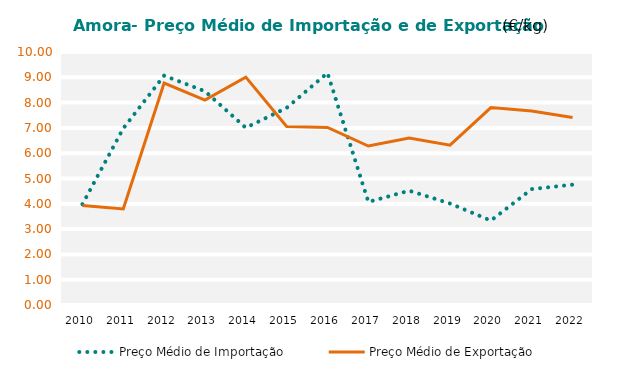
| Category | Preço Médio de Importação | Preço Médio de Exportação |
|---|---|---|
| 2010.0 | 3.983 | 3.931 |
| 2011.0 | 6.98 | 3.796 |
| 2012.0 | 9.066 | 8.77 |
| 2013.0 | 8.45 | 8.099 |
| 2014.0 | 7.005 | 9.008 |
| 2015.0 | 7.792 | 7.059 |
| 2016.0 | 9.173 | 7.019 |
| 2017.0 | 4.073 | 6.283 |
| 2018.0 | 4.518 | 6.599 |
| 2019.0 | 4.011 | 6.316 |
| 2020.0 | 3.336 | 7.804 |
| 2021.0 | 4.582 | 7.67 |
| 2022.0 | 4.755 | 7.415 |